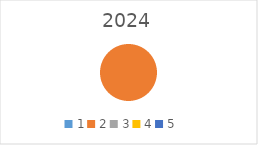
| Category | Series 0 |
|---|---|
| 1.0 | 0 |
| 2.0 | 342250 |
| 3.0 | 0 |
| 4.0 | 0 |
| 5.0 | 0 |